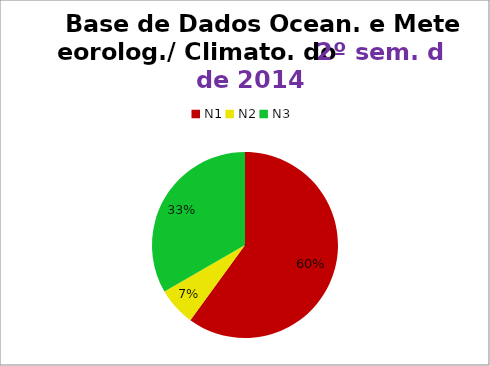
| Category | 2º/14 |
|---|---|
| N1 | 18 |
| N2 | 2 |
| N3 | 10 |